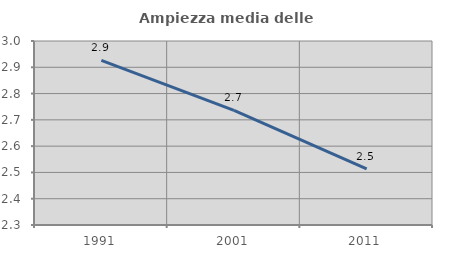
| Category | Ampiezza media delle famiglie |
|---|---|
| 1991.0 | 2.926 |
| 2001.0 | 2.736 |
| 2011.0 | 2.513 |